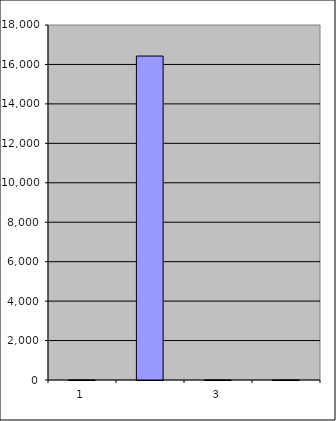
| Category | Series 0 |
|---|---|
| 0 | 1 |
| 1 | 16426.156 |
| 2 | 0.975 |
| 3 | 1.209 |